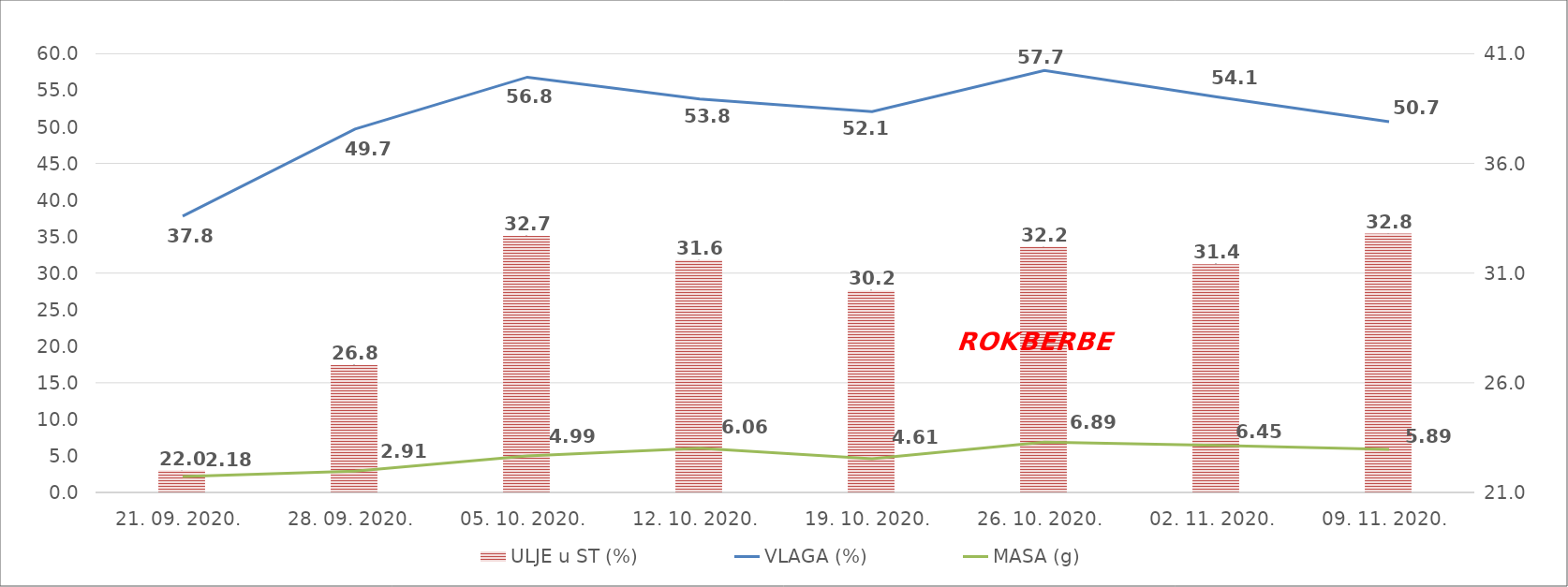
| Category | ULJE u ST (%) |
|---|---|
| 21. 09. 2020. | 22 |
| 28. 09. 2020. | 26.8 |
| 05. 10. 2020. | 32.7 |
| 12. 10. 2020. | 31.6 |
| 19. 10. 2020. | 30.2 |
| 26. 10. 2020. | 32.2 |
| 02. 11. 2020. | 31.4 |
| 09. 11. 2020. | 32.8 |